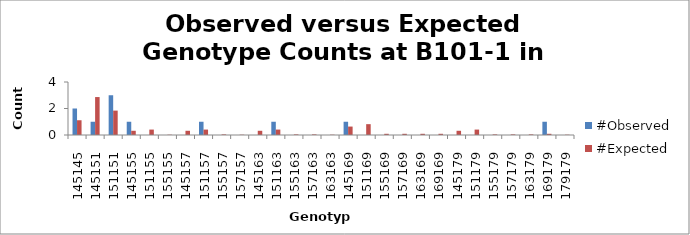
| Category | #Observed | #Expected |
|---|---|---|
| 145145.0 | 2 | 1.114 |
| 145151.0 | 1 | 2.864 |
| 151151.0 | 3 | 1.841 |
| 145155.0 | 1 | 0.318 |
| 151155.0 | 0 | 0.409 |
| 155155.0 | 0 | 0.023 |
| 145157.0 | 0 | 0.318 |
| 151157.0 | 1 | 0.409 |
| 155157.0 | 0 | 0.045 |
| 157157.0 | 0 | 0.023 |
| 145163.0 | 0 | 0.318 |
| 151163.0 | 1 | 0.409 |
| 155163.0 | 0 | 0.045 |
| 157163.0 | 0 | 0.045 |
| 163163.0 | 0 | 0.023 |
| 145169.0 | 1 | 0.636 |
| 151169.0 | 0 | 0.818 |
| 155169.0 | 0 | 0.091 |
| 157169.0 | 0 | 0.091 |
| 163169.0 | 0 | 0.091 |
| 169169.0 | 0 | 0.091 |
| 145179.0 | 0 | 0.318 |
| 151179.0 | 0 | 0.409 |
| 155179.0 | 0 | 0.045 |
| 157179.0 | 0 | 0.045 |
| 163179.0 | 0 | 0.045 |
| 169179.0 | 1 | 0.091 |
| 179179.0 | 0 | 0.023 |